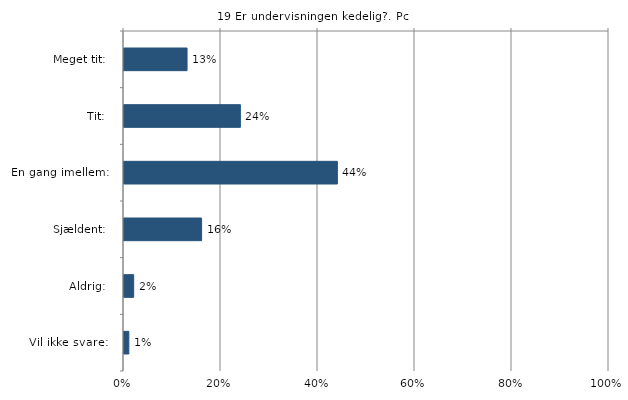
| Category | Er undervisningen kedelig? |
|---|---|
| Meget tit:   | 0.13 |
| Tit:   | 0.24 |
| En gang imellem:   | 0.44 |
| Sjældent:   | 0.16 |
| Aldrig:   | 0.02 |
| Vil ikke svare:   | 0.01 |